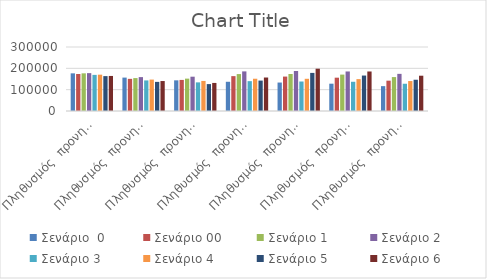
| Category | Σενάριο  0  | Σενάριο 00  | Σενάριο 1  | Σενάριο 2  | Σενάριο 3  | Σενάριο 4  | Σενάριο 5  | Σενάριο 6  |
|---|---|---|---|---|---|---|---|---|
| Πληθυσμός  προνηπιων (3-4 ετών) | 176498.281 | 173441.11 | 176539.99 | 177496.271 | 169316.419 | 170263.811 | 163519.223 | 164287.16 |
| Πληθυσμός  προνηπιων (3-4 ετών) | 156579.268 | 150674.275 | 154270.707 | 158862.499 | 143398.452 | 147224.645 | 136522.364 | 140446.802 |
| Πληθυσμός  προνηπιων (3-4 ετών) | 143765.68 | 145659.752 | 151741.415 | 160804.797 | 134189.009 | 140953.294 | 126139.983 | 131551.452 |
| Πληθυσμός  προνηπιων (3-4 ετών) | 136991.896 | 163443.666 | 173087.099 | 185666.837 | 139904.315 | 151220.757 | 142573.366 | 156942.926 |
| Πληθυσμός  προνηπιων (3-4 ετών) | 133387.842 | 161333.461 | 173544.062 | 187512.77 | 138232.764 | 150978.776 | 178593.453 | 198330.594 |
| Πληθυσμός  προνηπιων (3-4 ετών) | 128019.428 | 156203.566 | 170651.908 | 185303.227 | 136993.555 | 149474.973 | 166202.76 | 185235.546 |
| Πληθυσμός  προνηπιων (3-4 ετών) | 116511.346 | 142143.259 | 158989.795 | 174108.401 | 127730.367 | 140374.441 | 146515.77 | 165410.997 |